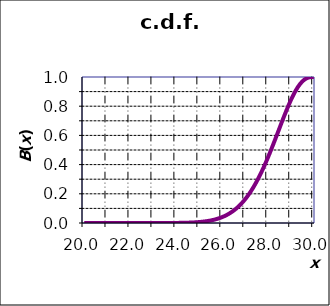
| Category | B(x) |
|---|---|
| 20.0 | 0 |
| 20.1 | 0 |
| 20.200000000000003 | 0 |
| 20.300000000000004 | 0 |
| 20.400000000000006 | 0 |
| 20.500000000000007 | 0 |
| 20.60000000000001 | 0 |
| 20.70000000000001 | 0 |
| 20.80000000000001 | 0 |
| 20.900000000000013 | 0 |
| 21.000000000000014 | 0 |
| 21.100000000000016 | 0 |
| 21.200000000000017 | 0 |
| 21.30000000000002 | 0 |
| 21.40000000000002 | 0 |
| 21.50000000000002 | 0 |
| 21.600000000000023 | 0 |
| 21.700000000000024 | 0 |
| 21.800000000000026 | 0 |
| 21.900000000000027 | 0 |
| 22.00000000000003 | 0 |
| 22.10000000000003 | 0 |
| 22.20000000000003 | 0 |
| 22.300000000000033 | 0 |
| 22.400000000000034 | 0 |
| 22.500000000000036 | 0 |
| 22.600000000000037 | 0 |
| 22.70000000000004 | 0 |
| 22.80000000000004 | 0 |
| 22.90000000000004 | 0 |
| 23.000000000000043 | 0 |
| 23.100000000000044 | 0 |
| 23.200000000000045 | 0 |
| 23.300000000000047 | 0 |
| 23.40000000000005 | 0 |
| 23.50000000000005 | 0 |
| 23.60000000000005 | 0 |
| 23.700000000000053 | 0 |
| 23.800000000000054 | 0 |
| 23.900000000000055 | 0 |
| 24.000000000000057 | 0.001 |
| 24.10000000000006 | 0.001 |
| 24.20000000000006 | 0.001 |
| 24.30000000000006 | 0.001 |
| 24.400000000000063 | 0.002 |
| 24.500000000000064 | 0.002 |
| 24.600000000000065 | 0.003 |
| 24.700000000000067 | 0.003 |
| 24.800000000000068 | 0.004 |
| 24.90000000000007 | 0.005 |
| 25.00000000000007 | 0.006 |
| 25.100000000000072 | 0.008 |
| 25.200000000000074 | 0.01 |
| 25.300000000000075 | 0.012 |
| 25.400000000000077 | 0.014 |
| 25.500000000000078 | 0.017 |
| 25.60000000000008 | 0.02 |
| 25.70000000000008 | 0.024 |
| 25.800000000000082 | 0.029 |
| 25.900000000000084 | 0.034 |
| 26.000000000000085 | 0.04 |
| 26.100000000000087 | 0.047 |
| 26.200000000000088 | 0.054 |
| 26.30000000000009 | 0.063 |
| 26.40000000000009 | 0.073 |
| 26.500000000000092 | 0.084 |
| 26.600000000000094 | 0.096 |
| 26.700000000000095 | 0.11 |
| 26.800000000000097 | 0.125 |
| 26.900000000000098 | 0.142 |
| 27.0000000000001 | 0.161 |
| 27.1000000000001 | 0.181 |
| 27.200000000000102 | 0.203 |
| 27.300000000000104 | 0.227 |
| 27.400000000000105 | 0.253 |
| 27.500000000000107 | 0.281 |
| 27.600000000000108 | 0.311 |
| 27.70000000000011 | 0.343 |
| 27.80000000000011 | 0.376 |
| 27.900000000000112 | 0.411 |
| 28.000000000000114 | 0.448 |
| 28.100000000000115 | 0.486 |
| 28.200000000000117 | 0.526 |
| 28.300000000000118 | 0.566 |
| 28.40000000000012 | 0.607 |
| 28.50000000000012 | 0.648 |
| 28.600000000000122 | 0.689 |
| 28.700000000000124 | 0.729 |
| 28.800000000000125 | 0.768 |
| 28.900000000000126 | 0.806 |
| 29.000000000000128 | 0.842 |
| 29.10000000000013 | 0.874 |
| 29.20000000000013 | 0.904 |
| 29.300000000000132 | 0.93 |
| 29.400000000000134 | 0.952 |
| 29.500000000000135 | 0.97 |
| 29.600000000000136 | 0.983 |
| 29.700000000000138 | 0.992 |
| 29.80000000000014 | 0.998 |
| 29.90000000000014 | 1 |
| 30.000000000000142 | 1 |